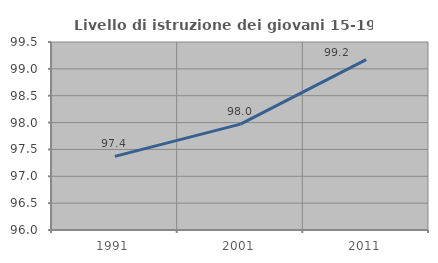
| Category | Livello di istruzione dei giovani 15-19 anni |
|---|---|
| 1991.0 | 97.37 |
| 2001.0 | 97.971 |
| 2011.0 | 99.171 |